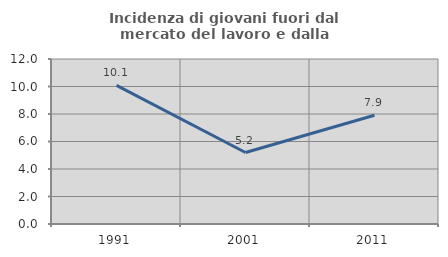
| Category | Incidenza di giovani fuori dal mercato del lavoro e dalla formazione  |
|---|---|
| 1991.0 | 10.078 |
| 2001.0 | 5.2 |
| 2011.0 | 7.907 |